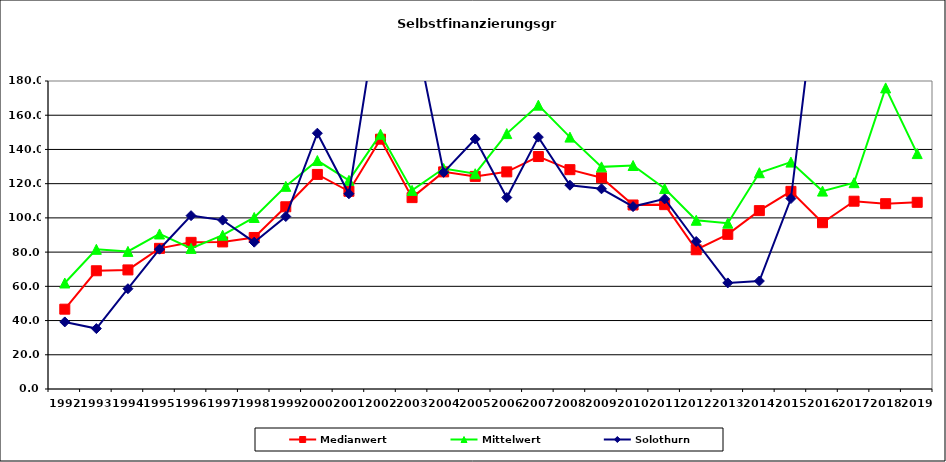
| Category | Medianwert | Mittelwert | Solothurn |
|---|---|---|---|
| 1992.0 | 46.65 | 61.956 | 39.2 |
| 1993.0 | 69.1 | 81.629 | 35.3 |
| 1994.0 | 69.6 | 80.414 | 58.6 |
| 1995.0 | 82.2 | 90.605 | 81.7 |
| 1996.0 | 85.7 | 82.181 | 101.3 |
| 1997.0 | 85.95 | 89.873 | 98.7 |
| 1998.0 | 88.55 | 100.246 | 85.8 |
| 1999.0 | 106.5 | 118.448 | 100.8 |
| 2000.0 | 125.4 | 133.52 | 149.5 |
| 2001.0 | 115.55 | 121.946 | 114.1 |
| 2002.0 | 146 | 148.915 | 230.9 |
| 2003.0 | 111.85 | 116.062 | 217.7 |
| 2004.0 | 126.9 | 128.865 | 126.6 |
| 2005.0 | 124.25 | 125.821 | 146.1 |
| 2006.0 | 126.9 | 149.264 | 111.9 |
| 2007.0 | 135.85 | 165.89 | 147.2 |
| 2008.0 | 128.185 | 147.205 | 119.1 |
| 2009.0 | 123.49 | 129.818 | 117 |
| 2010.0 | 107.55 | 130.614 | 106.6 |
| 2011.0 | 107.75 | 117.142 | 111.1 |
| 2012.0 | 81.375 | 98.616 | 86.2 |
| 2013.0 | 90.385 | 96.916 | 62 |
| 2014.0 | 104.25 | 126.395 | 63.1 |
| 2015.0 | 115.5 | 132.601 | 111.3 |
| 2016.0 | 97.18 | 115.652 | 262.7 |
| 2017.0 | 109.75 | 120.565 | 224.4 |
| 2018.0 | 108.3 | 175.965 | 1559.5 |
| 2019.0 | 109.1 | 137.577 | 365.4 |